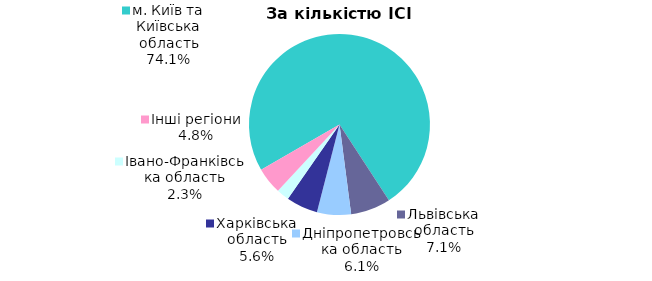
| Category | Series 0 |
|---|---|
| м. Київ та Київська область | 0.741 |
| Львівська область | 0.071 |
| Дніпропетровська область | 0.061 |
| Харківська область | 0.056 |
| Iвано-Франкiвська область | 0.023 |
| Інші регіони | 0.048 |